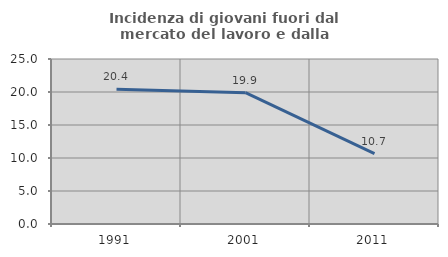
| Category | Incidenza di giovani fuori dal mercato del lavoro e dalla formazione  |
|---|---|
| 1991.0 | 20.413 |
| 2001.0 | 19.89 |
| 2011.0 | 10.663 |